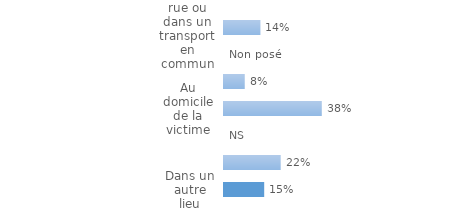
| Category | Series 0 |
|---|---|
| Dans la rue ou dans un transport en commun | 0.14 |
| Dans un établissement commercial | 0 |
| Sur le lieu de travail ou d'études  | 0.08 |
| Au domicile de la victime | 0.376 |
| Dans l'immeuble de la victime | 0 |
| Au domicile de quelqu'un d'autre | 0.218 |
| Dans un autre lieu | 0.155 |